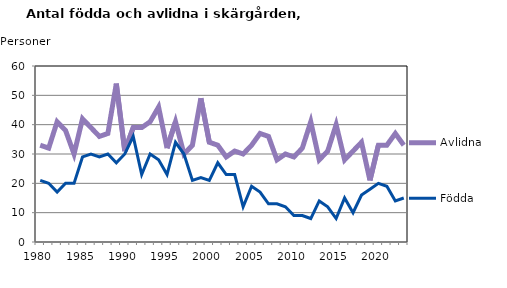
| Category | Avlidna | Födda |
|---|---|---|
| 1980.0 | 33 | 21 |
| 1981.0 | 32 | 20 |
| 1982.0 | 41 | 17 |
| 1983.0 | 38 | 20 |
| 1984.0 | 30 | 20 |
| 1985.0 | 42 | 29 |
| 1986.0 | 39 | 30 |
| 1987.0 | 36 | 29 |
| 1988.0 | 37 | 30 |
| 1989.0 | 54 | 27 |
| 1990.0 | 31 | 30 |
| 1991.0 | 39 | 36 |
| 1992.0 | 39 | 23 |
| 1993.0 | 41 | 30 |
| 1994.0 | 46 | 28 |
| 1995.0 | 32 | 23 |
| 1996.0 | 41 | 34 |
| 1997.0 | 30 | 30 |
| 1998.0 | 33 | 21 |
| 1999.0 | 49 | 22 |
| 2000.0 | 34 | 21 |
| 2001.0 | 33 | 27 |
| 2002.0 | 29 | 23 |
| 2003.0 | 31 | 23 |
| 2004.0 | 30 | 12 |
| 2005.0 | 33 | 19 |
| 2006.0 | 37 | 17 |
| 2007.0 | 36 | 13 |
| 2008.0 | 28 | 13 |
| 2009.0 | 30 | 12 |
| 2010.0 | 29 | 9 |
| 2011.0 | 32 | 9 |
| 2012.0 | 41 | 8 |
| 2013.0 | 28 | 14 |
| 2014.0 | 31 | 12 |
| 2015.0 | 40 | 8 |
| 2016.0 | 28 | 15 |
| 2017.0 | 31 | 10 |
| 2018.0 | 34 | 16 |
| 2019.0 | 21 | 18 |
| 2020.0 | 33 | 20 |
| 2021.0 | 33 | 19 |
| 2022.0 | 37 | 14 |
| 2023.0 | 33 | 15 |